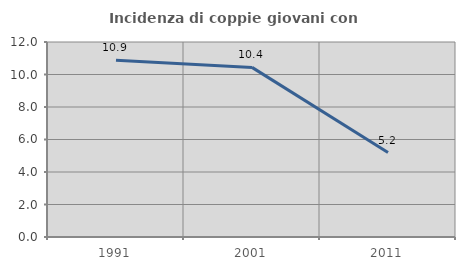
| Category | Incidenza di coppie giovani con figli |
|---|---|
| 1991.0 | 10.876 |
| 2001.0 | 10.438 |
| 2011.0 | 5.2 |